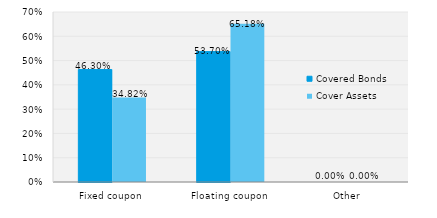
| Category | Covered Bonds | Cover Assets |
|---|---|---|
| Fixed coupon | 0.463 | 0.348 |
| Floating coupon | 0.537 | 0.652 |
| Other | 0 | 0 |